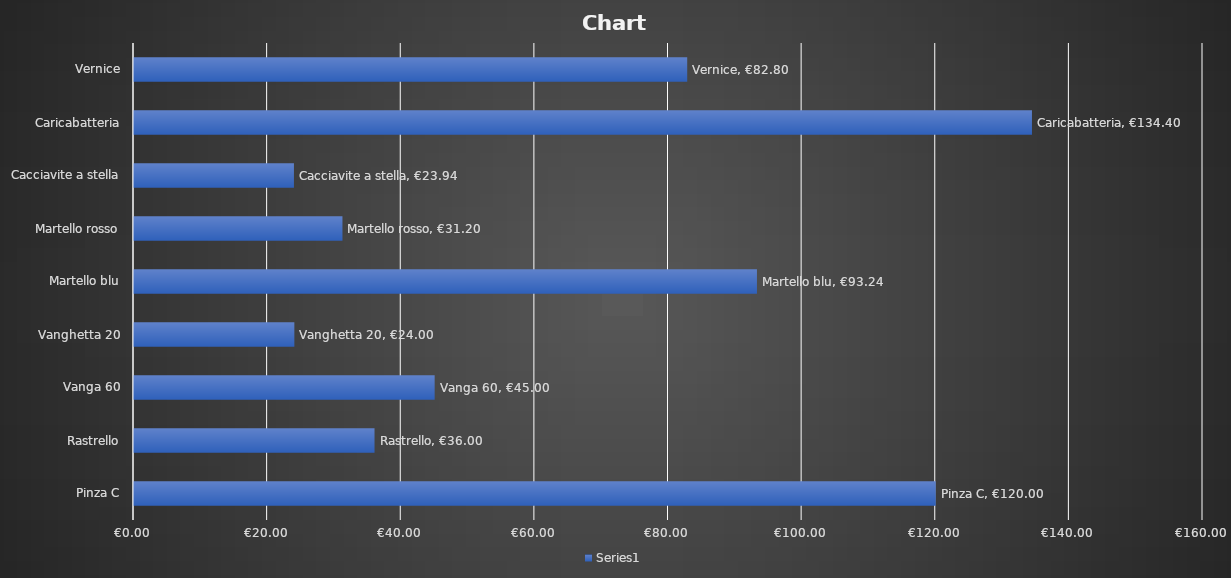
| Category | Series 0 |
|---|---|
| Pinza C | 120 |
| Rastrello | 36 |
| Vanga 60 | 45 |
| Vanghetta 20 | 24 |
| Martello blu | 93.24 |
| Martello rosso | 31.2 |
| Cacciavite a stella | 23.94 |
| Caricabatteria | 134.4 |
| Vernice | 82.8 |